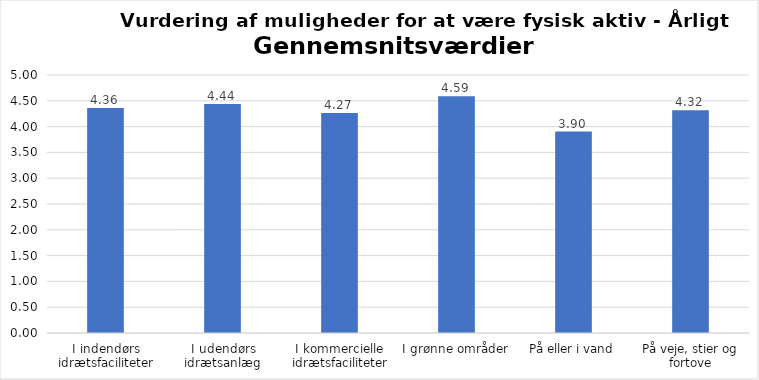
| Category | Gennemsnit |
|---|---|
| I indendørs idrætsfaciliteter | 4.359 |
| I udendørs idrætsanlæg | 4.438 |
| I kommercielle idrætsfaciliteter | 4.265 |
| I grønne områder | 4.589 |
| På eller i vand | 3.903 |
| På veje, stier og fortove | 4.318 |